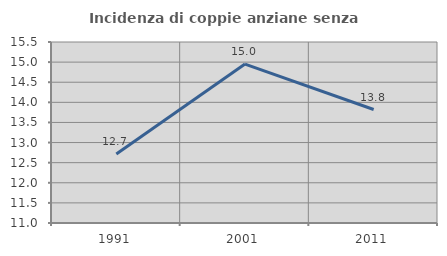
| Category | Incidenza di coppie anziane senza figli  |
|---|---|
| 1991.0 | 12.714 |
| 2001.0 | 14.951 |
| 2011.0 | 13.821 |